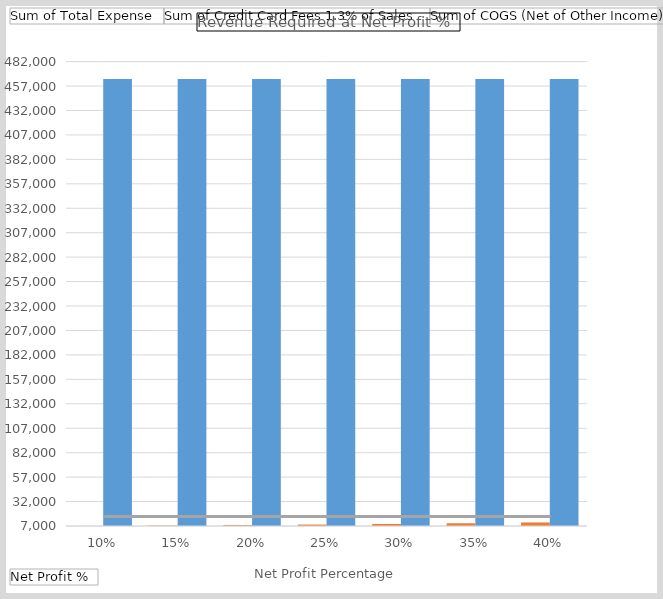
| Category | Sum of Credit Card Fees 1.3% of Sales | Sum of Total Expense |
|---|---|---|
| 10% | 7047.956 | 464087.464 |
| 15% | 7468.981 | 464087.464 |
| 20% | 7943.503 | 464087.464 |
| 25% | 8482.411 | 464087.464 |
| 30% | 9099.763 | 464087.464 |
| 35% | 9814.03 | 464087.464 |
| 40% | 10649.978 | 464087.464 |